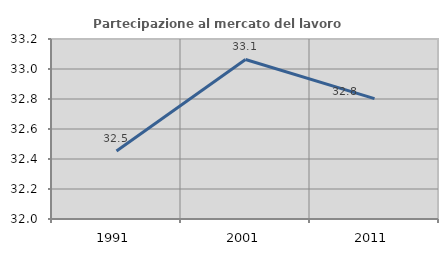
| Category | Partecipazione al mercato del lavoro  femminile |
|---|---|
| 1991.0 | 32.453 |
| 2001.0 | 33.064 |
| 2011.0 | 32.802 |